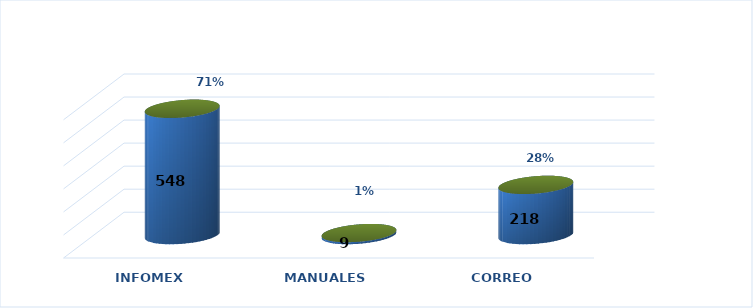
| Category | Series 0 | Series 1 |
|---|---|---|
| INFOMEX | 548 | 0.707 |
| MANUALES | 9 | 0.012 |
| CORREO | 218 | 0.281 |